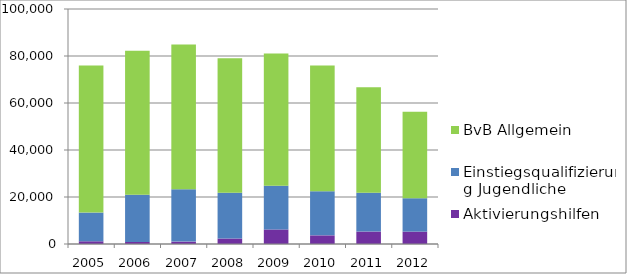
| Category | Aktivierungshilfen | Einstiegsqualifizierung Jugendliche | BvB Allgemein |
|---|---|---|---|
| 2005.0 | 1153 | 12221 | 62541 |
| 2006.0 | 896 | 20039 | 61311 |
| 2007.0 | 1012 | 22295 | 61631 |
| 2008.0 | 2330 | 19526 | 57211 |
| 2009.0 | 6183 | 18558 | 56272 |
| 2010.0 | 3678 | 18783 | 53476 |
| 2011.0 | 5295.917 | 16493 | 44872 |
| 2012.0 | 5270 | 14206 | 36810 |